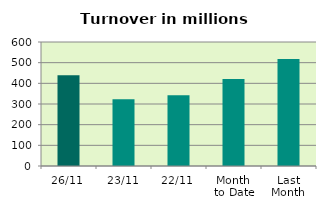
| Category | Series 0 |
|---|---|
| 26/11 | 439.111 |
| 23/11 | 323.48 |
| 22/11 | 342.086 |
| Month 
to Date | 420.842 |
| Last
Month | 517.71 |